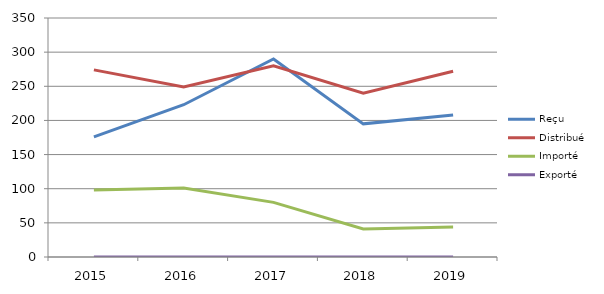
| Category | Reçu | Distribué | Importé | Exporté |
|---|---|---|---|---|
| 2015.0 | 176 | 274 | 98 | 0 |
| 2016.0 | 223 | 249 | 101 | 0 |
| 2017.0 | 290 | 280 | 80 | 0 |
| 2018.0 | 195 | 240 | 41 | 0 |
| 2019.0 | 208 | 272 | 44 | 0 |